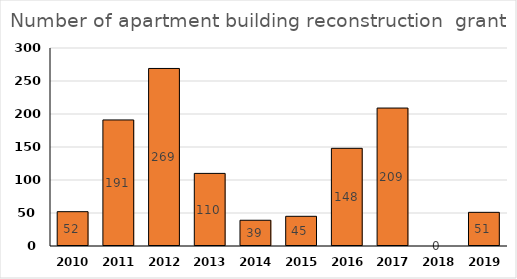
| Category | Number of apartment building reconstruction  grants |
|---|---|
| 2010 | 52 |
| 2011 | 191 |
| 2012 | 269 |
| 2013 | 110 |
| 2014 | 39 |
| 2015 | 45 |
| 2016 | 148 |
| 2017 | 209 |
| 2018 | 0 |
| 2019 | 51 |